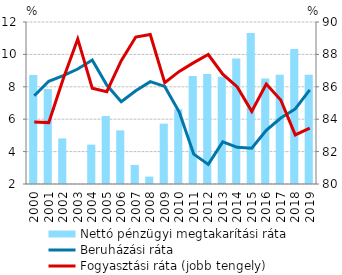
| Category | Nettó pénzügyi megtakarítási ráta |
|---|---|
| 2000.0 | 8.728 |
| 2001.0 | 7.869 |
| 2002.0 | 4.815 |
| 2003.0 | 1.947 |
| 2004.0 | 4.431 |
| 2005.0 | 6.195 |
| 2006.0 | 5.309 |
| 2007.0 | 3.176 |
| 2008.0 | 2.458 |
| 2009.0 | 5.725 |
| 2010.0 | 6.61 |
| 2011.0 | 8.664 |
| 2012.0 | 8.795 |
| 2013.0 | 8.626 |
| 2014.0 | 9.748 |
| 2015.0 | 11.314 |
| 2016.0 | 8.512 |
| 2017.0 | 8.745 |
| 2018.0 | 10.336 |
| 2019.0 | 8.745 |